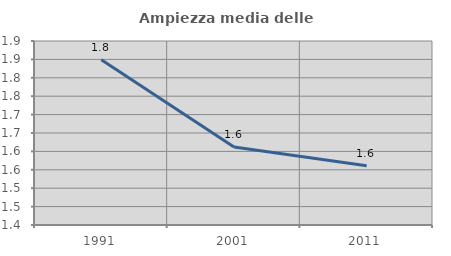
| Category | Ampiezza media delle famiglie |
|---|---|
| 1991.0 | 1.849 |
| 2001.0 | 1.612 |
| 2011.0 | 1.561 |